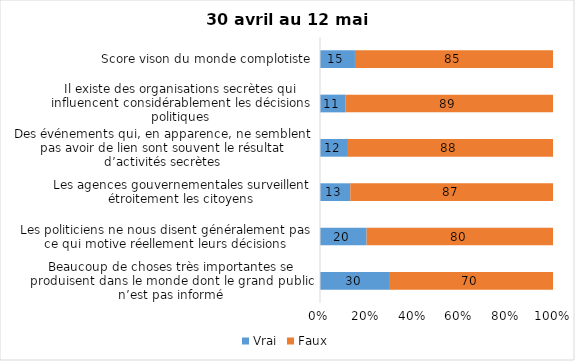
| Category | Vrai | Faux |
|---|---|---|
| Beaucoup de choses très importantes se produisent dans le monde dont le grand public n’est pas informé | 30 | 70 |
| Les politiciens ne nous disent généralement pas ce qui motive réellement leurs décisions | 20 | 80 |
| Les agences gouvernementales surveillent étroitement les citoyens | 13 | 87 |
| Des événements qui, en apparence, ne semblent pas avoir de lien sont souvent le résultat d’activités secrètes | 12 | 88 |
| Il existe des organisations secrètes qui influencent considérablement les décisions politiques | 11 | 89 |
| Score vison du monde complotiste | 15 | 85 |